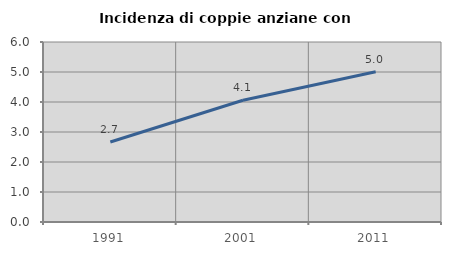
| Category | Incidenza di coppie anziane con figli |
|---|---|
| 1991.0 | 2.667 |
| 2001.0 | 4.058 |
| 2011.0 | 5.009 |